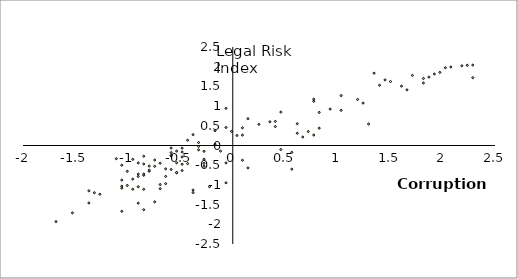
| Category | Legal |
|---|---|
| -0.37841444551735476 | -1.196 |
| -0.6398332583889134 | -0.968 |
| -0.5352657332402899 | -0.694 |
| -0.6921170209632251 | -0.991 |
| 1.7129360574551145 | 1.779 |
| 1.5038010071578676 | 1.623 |
| -0.8489683086861604 | -1.112 |
| -0.16927939522010782 | 0.375 |
| -1.0581033589834072 | -1.67 |
| 1.608368532306491 | 1.507 |
| -0.5352657332402899 | -0.684 |
| -0.6921170209632251 | -1.095 |
| -0.37841444551735476 | -1.132 |
| 0.7195445685431916 | 0.354 |
| -0.32613068294304304 | -0.111 |
| -0.27384692036873126 | -0.529 |
| -1.3718059344292777 | -1.459 |
| -1.0581033589834072 | -0.878 |
| 1.8697873451780496 | 1.735 |
| -1.3718059344292777 | -1.149 |
| 1.033247143989062 | 0.892 |
| -0.32613068294304304 | 0.076 |
| -0.4829819706659782 | -0.165 |
| 0.6149770433945682 | 0.31 |
| 0.14442318022576256 | -0.569 |
| 0.45812575567163294 | -0.102 |
| 0.45812575567163294 | 0.848 |
| -1.319522171854966 | -1.198 |
| 2.2880574457725436 | 1.721 |
| -0.7966845461118486 | -0.522 |
| -0.7966845461118486 | -0.654 |
| -0.6398332583889134 | -0.785 |
| -0.5352657332402899 | -0.44 |
| 1.242382194286309 | 1.076 |
| -0.6398332583889134 | -0.593 |
| 2.2357736831982318 | 2.036 |
| 1.1900984317119971 | 1.168 |
| -0.5875494958146017 | -0.609 |
| 0.5626932808202564 | -0.6 |
| 1.817503582603738 | 1.587 |
| -0.16927939522010782 | 0.031 |
| -0.11699563264579609 | -0.141 |
| -0.9535358338347838 | -0.351 |
| -0.8489683086861604 | -0.469 |
| 0.09213941765145083 | 0.264 |
| 1.6606522948808027 | 1.413 |
| -0.32613068294304304 | -0.024 |
| -0.4829819706659782 | -0.291 |
| -0.901252071260472 | -0.725 |
| 1.399233482009244 | 1.529 |
| 0.9286796188404385 | 0.925 |
| 0.0398556550771391 | 0.255 |
| -0.37841444551735476 | 0.276 |
| 1.3469497194349322 | 1.835 |
| 0.09213941765145083 | 0.448 |
| -0.901252071260472 | -0.785 |
| -1.0581033589834072 | -0.5 |
| 0.3535582305230095 | 0.603 |
| -0.27384692036873126 | -0.148 |
| 0.5626932808202564 | -0.174 |
| -0.9535358338347838 | -0.853 |
| -0.4829819706659782 | -0.475 |
| 0.6672608059688798 | 0.214 |
| -1.0581033589834072 | -1.033 |
| -0.7966845461118486 | -0.625 |
| 0.14442318022576256 | 0.68 |
| -0.7444007835375368 | -0.528 |
| -1.0058195964090955 | -1.015 |
| 0.4058419930973212 | 0.481 |
| -0.8489683086861604 | -0.273 |
| -0.8489683086861604 | -1.629 |
| -0.06471187007148436 | -0.947 |
| -0.4829819706659782 | -0.067 |
| -1.0058195964090955 | -0.655 |
| -0.901252071260472 | -0.443 |
| 1.9220711077523613 | 1.814 |
| 2.2880574457725436 | 2.041 |
| -1.0581033589834072 | -1.083 |
| -0.9535358338347838 | -1.11 |
| 2.0266386329009847 | 1.974 |
| -0.06471187007148436 | 0.458 |
| -0.7444007835375368 | -1.43 |
| -0.4306982080916665 | 0.134 |
| -0.8489683086861604 | -0.754 |
| -0.5875494958146017 | -0.257 |
| -0.5875494958146017 | -0.181 |
| 0.824112093691815 | 0.44 |
| 0.824112093691815 | 0.84 |
| 0.7718283311175033 | 1.176 |
| 0.09213941765145083 | -0.375 |
| -0.901252071260472 | -1.047 |
| 0.4058419930973212 | 0.611 |
| -0.01242810749717263 | 0.359 |
| -0.06471187007148436 | -0.442 |
| -0.22156315779441954 | -1.046 |
| -0.8489683086861604 | -0.724 |
| 1.9743548703266731 | 1.856 |
| 0.24899070537438603 | 0.536 |
| 0.7718283311175033 | 0.266 |
| -0.06471187007148436 | 0.942 |
| 0.6149770433945682 | 0.553 |
| -0.5352657332402899 | -0.141 |
| 2.18348992062392 | 2.024 |
| 2.0789223954752964 | 1.992 |
| 0.7718283311175033 | 1.123 |
| -0.7444007835375368 | -0.369 |
| -0.5875494958146017 | -0.259 |
| -0.4829819706659782 | -0.635 |
| -0.5875494958146017 | -0.065 |
| -0.27384692036873126 | -0.349 |
| -0.27384692036873126 | -0.454 |
| -1.110387121557719 | -0.335 |
| -0.901252071260472 | -1.463 |
| 1.033247143989062 | 1.267 |
| 1.817503582603738 | 1.702 |
| 1.4515172445835558 | 1.665 |
| 1.2946659568606207 | 0.547 |
| -1.5286572221522128 | -1.71 |
| -0.6921170209632251 | -0.45 |
| -1.6855085098751479 | -1.932 |
| -0.4306982080916665 | -0.459 |
| -1.2672384092806541 | -1.237 |